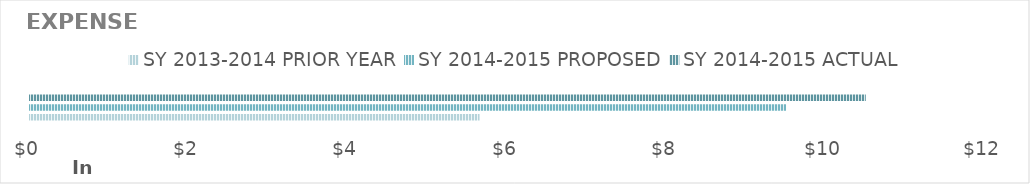
| Category | SY 2013-2014 | SY 2014-2015 |
|---|---|---|
| 0 | 5648.78 | 10502.12 |